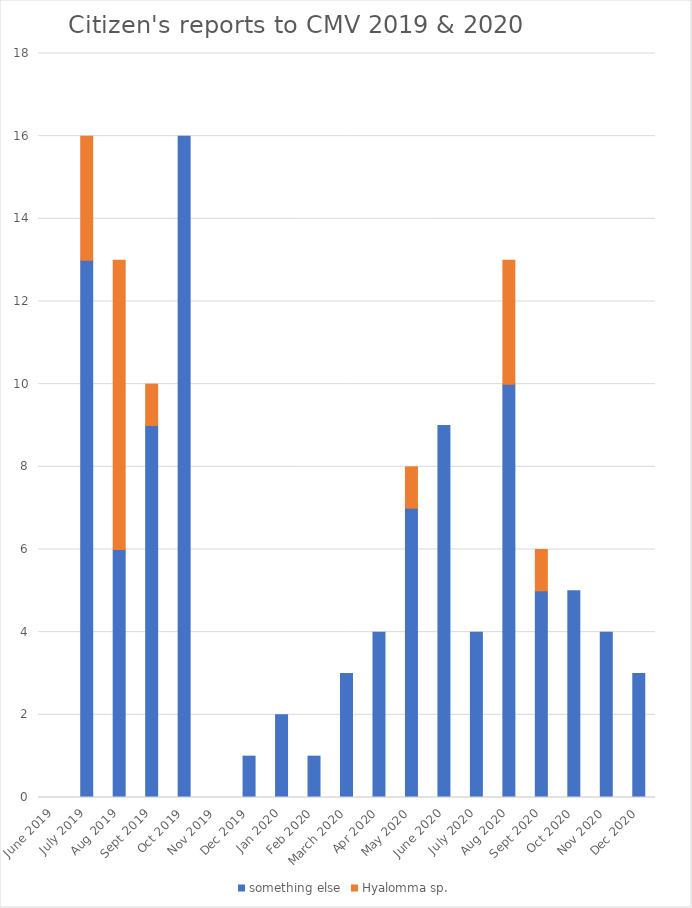
| Category | something else | Hyalomma sp. |
|---|---|---|
| June 2019 | 0 | 0 |
| July 2019 | 13 | 3 |
| Aug 2019 | 6 | 7 |
| Sept 2019 | 9 | 1 |
| Oct 2019 | 16 | 0 |
| Nov 2019 | 0 | 0 |
| Dec 2019 | 1 | 0 |
| Jan 2020 | 2 | 0 |
| Feb 2020 | 1 | 0 |
| March 2020 | 3 | 0 |
| Apr 2020 | 4 | 0 |
| May 2020 | 7 | 1 |
| June 2020 | 9 | 0 |
| July 2020 | 4 | 0 |
| Aug 2020 | 10 | 3 |
| Sept 2020 | 5 | 1 |
| Oct 2020 | 5 | 0 |
| Nov 2020 | 4 | 0 |
| Dec 2020 | 3 | 0 |